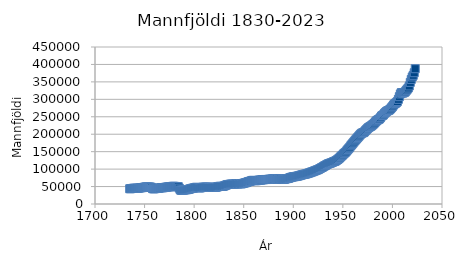
| Category | Mannfjöldi 1. janúar |
|---|---|
| 1735.0 | 43678 |
| 1736.0 | 43872 |
| 1737.0 | 44360 |
| 1738.0 | 44703 |
| 1739.0 | 45208 |
| 1740.0 | 45022 |
| 1741.0 | 44878 |
| 1742.0 | 45382 |
| 1743.0 | 45054 |
| 1744.0 | 45490 |
| 1745.0 | 45926 |
| 1746.0 | 46435 |
| 1747.0 | 46866 |
| 1748.0 | 47058 |
| 1749.0 | 47676 |
| 1750.0 | 48241 |
| 1751.0 | 48754 |
| 1752.0 | 49121 |
| 1753.0 | 48830 |
| 1754.0 | 48752 |
| 1755.0 | 48798 |
| 1756.0 | 48620 |
| 1757.0 | 47602 |
| 1758.0 | 44210 |
| 1759.0 | 43329 |
| 1760.0 | 43716 |
| 1761.0 | 44219 |
| 1762.0 | 44839 |
| 1763.0 | 44886 |
| 1764.0 | 44866 |
| 1765.0 | 45676 |
| 1766.0 | 46420 |
| 1767.0 | 46702 |
| 1768.0 | 46481 |
| 1769.0 | 46788 |
| 1770.0 | 47361 |
| 1771.0 | 47857 |
| 1772.0 | 48207 |
| 1773.0 | 48623 |
| 1774.0 | 48968 |
| 1775.0 | 49234 |
| 1776.0 | 49577 |
| 1777.0 | 49931 |
| 1778.0 | 50421 |
| 1779.0 | 50764 |
| 1780.0 | 50630 |
| 1781.0 | 50318 |
| 1782.0 | 49611 |
| 1783.0 | 49609 |
| 1784.0 | 49753 |
| 1785.0 | 45428 |
| 1786.0 | 40381 |
| 1787.0 | 39190 |
| 1788.0 | 39490 |
| 1789.0 | 39689 |
| 1790.0 | 40051 |
| 1791.0 | 40667 |
| 1792.0 | 40926 |
| 1793.0 | 41117 |
| 1794.0 | 41666 |
| 1795.0 | 42446 |
| 1796.0 | 43430 |
| 1797.0 | 44308 |
| 1798.0 | 45016 |
| 1799.0 | 45445 |
| 1800.0 | 46176 |
| 1801.0 | 47186 |
| 1802.0 | 47812 |
| 1803.0 | 47713 |
| 1804.0 | 46916 |
| 1805.0 | 46251 |
| 1806.0 | 46079 |
| 1807.0 | 46756 |
| 1808.0 | 47472 |
| 1809.0 | 47982 |
| 1810.0 | 48271 |
| 1811.0 | 48587 |
| 1812.0 | 48570 |
| 1813.0 | 48317 |
| 1814.0 | 47805 |
| 1815.0 | 47501 |
| 1816.0 | 47644 |
| 1817.0 | 47333 |
| 1818.0 | 47712 |
| 1819.0 | 47952 |
| 1820.0 | 47994 |
| 1821.0 | 48065 |
| 1822.0 | 47880 |
| 1823.0 | 48743 |
| 1824.0 | 49546 |
| 1825.0 | 50312 |
| 1826.0 | 50663 |
| 1827.0 | 50576 |
| 1828.0 | 50340 |
| 1829.0 | 50600 |
| 1830.0 | 51403 |
| 1831.0 | 52630 |
| 1832.0 | 53892 |
| 1833.0 | 54995 |
| 1834.0 | 55903 |
| 1835.0 | 55987 |
| 1836.0 | 56583 |
| 1837.0 | 56968 |
| 1838.0 | 57080 |
| 1839.0 | 57088 |
| 1840.0 | 56893 |
| 1841.0 | 57133 |
| 1842.0 | 57778 |
| 1843.0 | 58385 |
| 1844.0 | 57229 |
| 1845.0 | 57957 |
| 1846.0 | 58677 |
| 1847.0 | 57499 |
| 1848.0 | 57936 |
| 1849.0 | 58841 |
| 1850.0 | 59586 |
| 1851.0 | 60416 |
| 1852.0 | 60874 |
| 1853.0 | 61875 |
| 1854.0 | 63209 |
| 1855.0 | 64246 |
| 1856.0 | 64844 |
| 1857.0 | 65786 |
| 1858.0 | 66829 |
| 1859.0 | 67697 |
| 1860.0 | 67754 |
| 1861.0 | 66839 |
| 1862.0 | 66963 |
| 1863.0 | 66792 |
| 1864.0 | 67315 |
| 1865.0 | 68064 |
| 1866.0 | 68711 |
| 1867.0 | 68268 |
| 1868.0 | 69231 |
| 1869.0 | 69700 |
| 1870.0 | 69463 |
| 1871.0 | 70031 |
| 1872.0 | 70389 |
| 1873.0 | 70065 |
| 1874.0 | 70276 |
| 1875.0 | 70595 |
| 1876.0 | 71129 |
| 1877.0 | 70798 |
| 1878.0 | 71555 |
| 1879.0 | 71901 |
| 1880.0 | 71981 |
| 1881.0 | 72646 |
| 1882.0 | 73091 |
| 1883.0 | 71942 |
| 1884.0 | 70642 |
| 1885.0 | 71481 |
| 1886.0 | 72243 |
| 1887.0 | 72449 |
| 1888.0 | 70725 |
| 1889.0 | 70146 |
| 1890.0 | 70581 |
| 1891.0 | 70607 |
| 1892.0 | 71579 |
| 1893.0 | 72481 |
| 1894.0 | 72928 |
| 1895.0 | 73230 |
| 1896.0 | 74508 |
| 1897.0 | 75680 |
| 1898.0 | 76618 |
| 1899.0 | 77177 |
| 1900.0 | 77967 |
| 1901.0 | 78203 |
| 1902.0 | 78641 |
| 1903.0 | 79181 |
| 1904.0 | 79632 |
| 1905.0 | 80396 |
| 1906.0 | 81026 |
| 1907.0 | 82086 |
| 1908.0 | 82925 |
| 1909.0 | 83576 |
| 1910.0 | 84528 |
| 1911.0 | 85221 |
| 1912.0 | 85661 |
| 1913.0 | 86116 |
| 1914.0 | 87137 |
| 1915.0 | 88076 |
| 1916.0 | 89059 |
| 1917.0 | 89819 |
| 1918.0 | 91368 |
| 1919.0 | 91897 |
| 1920.0 | 92855 |
| 1921.0 | 94436 |
| 1922.0 | 95180 |
| 1923.0 | 96386 |
| 1924.0 | 97704 |
| 1925.0 | 98483 |
| 1926.0 | 100117 |
| 1927.0 | 101730 |
| 1928.0 | 103327 |
| 1929.0 | 104812 |
| 1930.0 | 106360 |
| 1931.0 | 108629 |
| 1932.0 | 109844 |
| 1933.0 | 111555 |
| 1934.0 | 113366 |
| 1935.0 | 114743 |
| 1936.0 | 115870 |
| 1937.0 | 116880 |
| 1938.0 | 117692 |
| 1939.0 | 118888 |
| 1940.0 | 120264 |
| 1941.0 | 121579 |
| 1942.0 | 122385 |
| 1943.0 | 123996 |
| 1944.0 | 125967 |
| 1945.0 | 127791 |
| 1946.0 | 130356 |
| 1947.0 | 132750 |
| 1948.0 | 135935 |
| 1949.0 | 138502 |
| 1950.0 | 141042 |
| 1951.0 | 144293 |
| 1952.0 | 146540 |
| 1953.0 | 148978 |
| 1954.0 | 152506 |
| 1955.0 | 156033 |
| 1956.0 | 159480 |
| 1957.0 | 162700 |
| 1958.0 | 166831 |
| 1959.0 | 170156 |
| 1960.0 | 173855 |
| 1961.0 | 177292 |
| 1962.0 | 180765 |
| 1963.0 | 183991 |
| 1964.0 | 187314 |
| 1965.0 | 190652 |
| 1966.0 | 193919 |
| 1967.0 | 197221 |
| 1968.0 | 200281 |
| 1969.0 | 202695 |
| 1970.0 | 204042 |
| 1971.0 | 204834 |
| 1972.0 | 207361 |
| 1973.0 | 210912 |
| 1974.0 | 213722 |
| 1975.0 | 216695 |
| 1976.0 | 219262 |
| 1977.0 | 221046 |
| 1978.0 | 222552 |
| 1979.0 | 224522 |
| 1980.0 | 226948 |
| 1981.0 | 229327 |
| 1982.0 | 232182 |
| 1983.0 | 235537 |
| 1984.0 | 238416 |
| 1985.0 | 240606 |
| 1986.0 | 242203 |
| 1987.0 | 244157 |
| 1988.0 | 247561 |
| 1989.0 | 251919 |
| 1990.0 | 253785 |
| 1991.0 | 255866 |
| 1992.0 | 259727 |
| 1993.0 | 262386 |
| 1994.0 | 265064 |
| 1995.0 | 266978 |
| 1996.0 | 267958 |
| 1997.0 | 269874 |
| 1998.0 | 272381 |
| 1999.0 | 275712 |
| 2000.0 | 279049 |
| 2001.0 | 283361 |
| 2002.0 | 286575 |
| 2003.0 | 288471 |
| 2004.0 | 290570 |
| 2005.0 | 293577 |
| 2006.0 | 299891 |
| 2007.0 | 307672 |
| 2008.0 | 315459 |
| 2009.0 | 319368 |
| 2010.0 | 317630 |
| 2011.0 | 318452 |
| 2012.0 | 319575 |
| 2013.0 | 321857 |
| 2014.0 | 325671 |
| 2015.0 | 329100 |
| 2016.0 | 332529 |
| 2017.0 | 338349 |
| 2018.0 | 348450 |
| 2019.0 | 356991 |
| 2020.0 | 364134 |
| 2021.0 | 368792 |
| 2022.0 | 376248 |
| 2023.0 | 387758 |